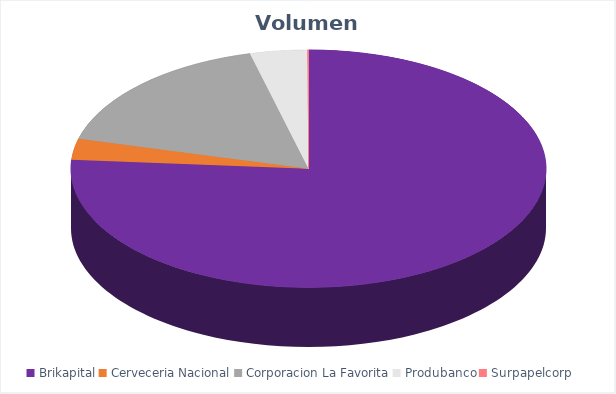
| Category | VOLUMEN ($USD) |
|---|---|
| Brikapital | 380000 |
| Cerveceria Nacional | 14274 |
| Corporacion La Favorita | 84686.31 |
| Produbanco | 19358.26 |
| Surpapelcorp | 425 |